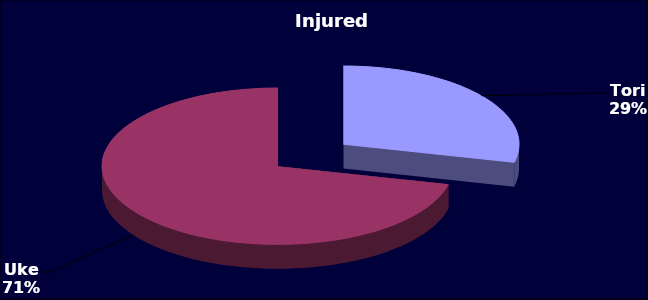
| Category | Series 0 |
|---|---|
| Tori | 56 |
| Uke | 139 |